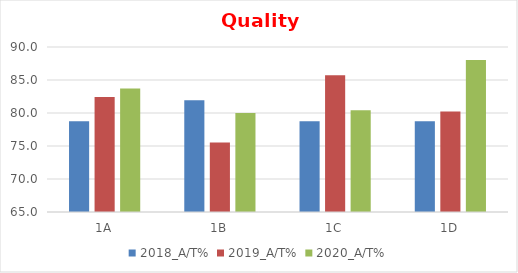
| Category | 2018_A/T% | 2019_A/T% | 2020_A/T% |
|---|---|---|---|
| 1A | 78.75 | 82.418 | 83.696 |
| 1B | 81.928 | 75.532 | 80 |
| 1C | 78.75 | 85.714 | 80.435 |
| 1D | 78.75 | 80.22 | 88.043 |